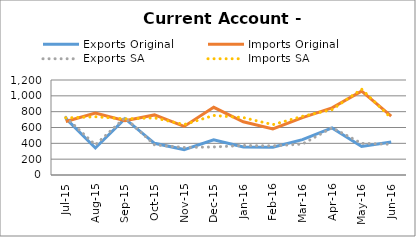
| Category | Exports Original | Imports Original | Exports SA | Imports SA |
|---|---|---|---|---|
| 2015-07-11 | 715 | 676 | 728 | 721 |
| 2015-08-11 | 341 | 782 | 380 | 736 |
| 2015-09-11 | 711 | 687 | 725 | 709 |
| 2015-10-11 | 400 | 759 | 381 | 722 |
| 2015-11-11 | 321 | 614 | 348 | 637 |
| 2015-12-11 | 444 | 855 | 354 | 752 |
| 2016-01-11 | 354 | 672 | 373 | 725 |
| 2016-02-11 | 351 | 582 | 368 | 636 |
| 2016-03-11 | 447 | 724 | 391 | 741 |
| 2016-04-11 | 594 | 848 | 597 | 826 |
| 2016-05-11 | 361 | 1060 | 400 | 1084 |
| 2016-06-11 | 417 | 743 | 388 | 719 |